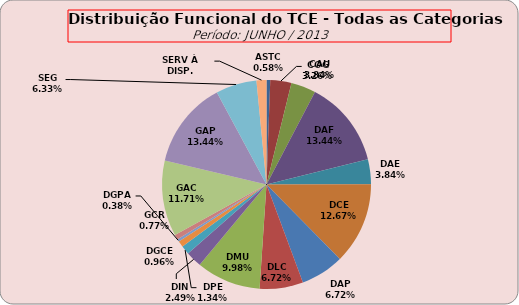
| Category | ASTC COG CAU DAF DAE DCE DAP DLC DMU DIN DPE DGCE DGPA GCR GAC GAP SEG SERV À DISP. |
|---|---|
| ASTC | 3 |
| COG | 17 |
| CAU | 20 |
| DAF | 70 |
| DAE | 20 |
| DCE | 66 |
| DAP | 35 |
| DLC | 35 |
| DMU | 52 |
| DIN | 13 |
| DPE | 7 |
| DGCE | 5 |
| DGPA | 2 |
| GCR | 4 |
| GAC | 61 |
| GAP | 70 |
| SEG | 33 |
| SERV À DISP. | 8 |